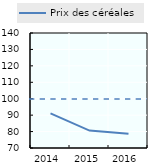
| Category | Prix des céréales |
|---|---|
| 2014.0 | 91.028 |
| 2015.0 | 80.579 |
| 2016.0 | 78.651 |